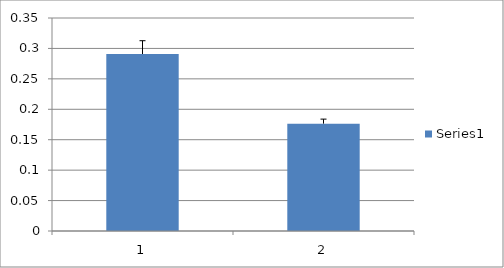
| Category | Series 0 |
|---|---|
| 0 | 0.291 |
| 1 | 0.176 |